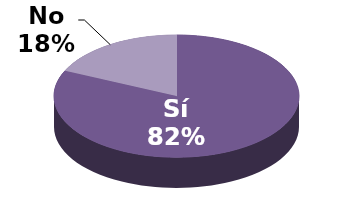
| Category | Series 1 |
|---|---|
| Sí | 9 |
| No | 2 |